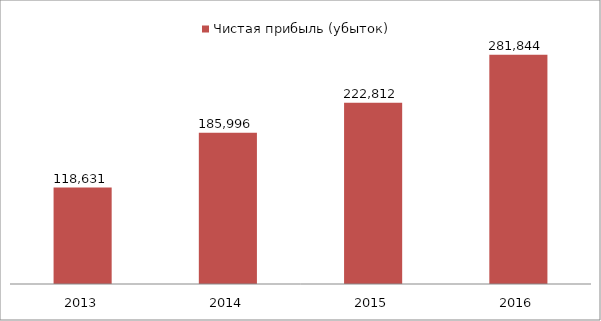
| Category | Чистая прибыль (убыток) |
|---|---|
| 2013.0 | 118631.206 |
| 2014.0 | 185996.481 |
| 2015.0 | 222812.144 |
| 2016.0 | 281844.186 |